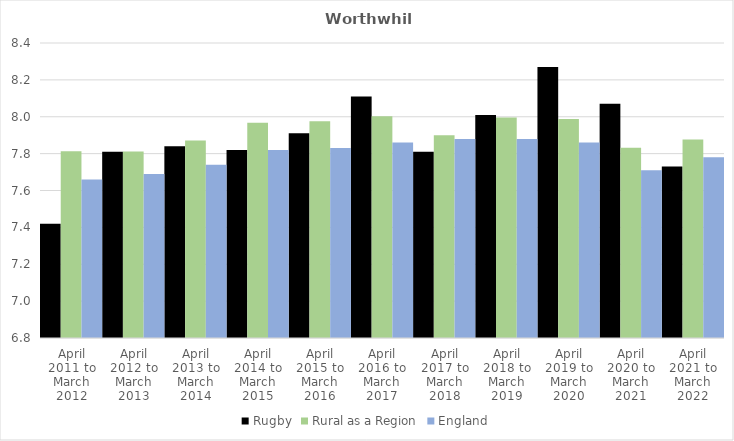
| Category | Rugby | Rural as a Region | England |
|---|---|---|---|
| April 2011 to March 2012 | 7.42 | 7.813 | 7.66 |
| April 2012 to March 2013 | 7.81 | 7.811 | 7.69 |
| April 2013 to March 2014 | 7.84 | 7.871 | 7.74 |
| April 2014 to March 2015 | 7.82 | 7.967 | 7.82 |
| April 2015 to March 2016 | 7.91 | 7.975 | 7.83 |
| April 2016 to March 2017 | 8.11 | 8.002 | 7.86 |
| April 2017 to March 2018 | 7.81 | 7.9 | 7.88 |
| April 2018 to March 2019 | 8.01 | 7.996 | 7.88 |
| April 2019 to March 2020 | 8.27 | 7.988 | 7.86 |
| April 2020 to March 2021 | 8.07 | 7.831 | 7.71 |
| April 2021 to March 2022 | 7.73 | 7.877 | 7.78 |